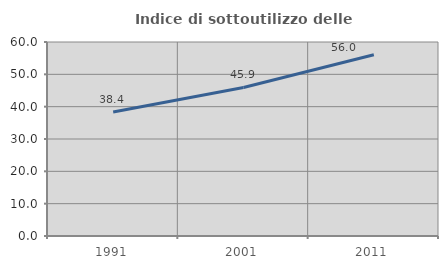
| Category | Indice di sottoutilizzo delle abitazioni  |
|---|---|
| 1991.0 | 38.375 |
| 2001.0 | 45.94 |
| 2011.0 | 56.033 |